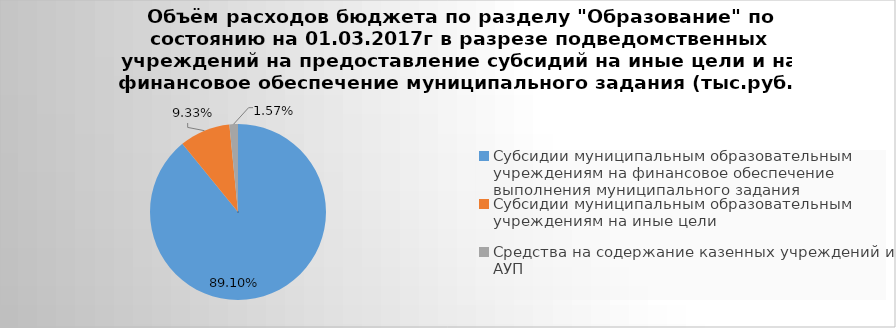
| Category | Series 0 |
|---|---|
| Субсидии муниципальным образовательным учреждениям на финансовое обеспечение выполнения муниципального задания | 4608673.15 |
| Субсидии муниципальным образовательным учреждениям на иные цели | 482596.61 |
| Средства на содержание казенных учреждений и АУП | 81117.55 |